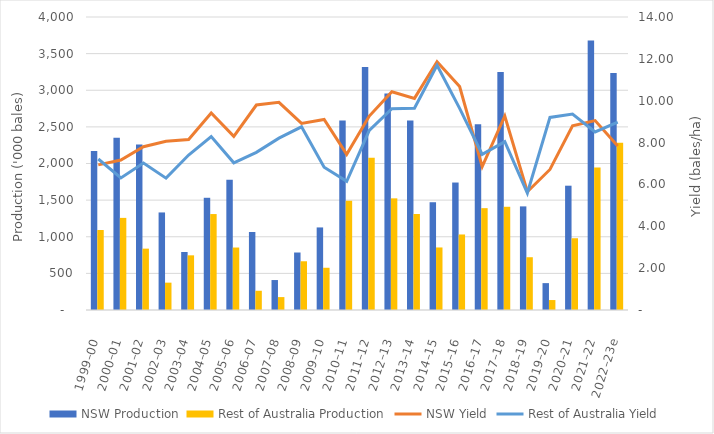
| Category | NSW Production | Rest of Australia Production |
|---|---|---|
| 1999–00 | 2170.392 | 1091.797 |
| 2000–01 | 2350.189 | 1257.577 |
| 2001–02 | 2260.489 | 837.59 |
| 2002–03 | 1331.789 | 373.344 |
| 2003–04 | 791.762 | 746.335 |
| 2004–05 | 1532.053 | 1309.894 |
| 2005–06 | 1777.533 | 852.85 |
| 2006–07 | 1065.075 | 262.736 |
| 2007–08 | 409 | 176.15 |
| 2008–09 | 784.894 | 665.264 |
| 2009–10 | 1127.26 | 576.687 |
| 2010–11 | 2586.67 | 1491.304 |
| 2011–12 | 3317.828 | 2077.048 |
| 2012–13 | 2955.947 | 1524.229 |
| 2013–14 | 2588.463 | 1310.586 |
| 2014–15 | 1471.225 | 853.775 |
| 2015–16 | 1740.198 | 1031.115 |
| 2016–17 | 2534.802 | 1390.308 |
| 2017–18 | 3249.604 | 1409.119 |
| 2018–19 | 1414.449 | 720.396 |
| 2019–20 | 366.872 | 135.881 |
| 2020–21 | 1696.96 | 979.648 |
| 2021–22 | 3678.789 | 1946.396 |
| 2022–23e | 3235.661 | 2281.872 |